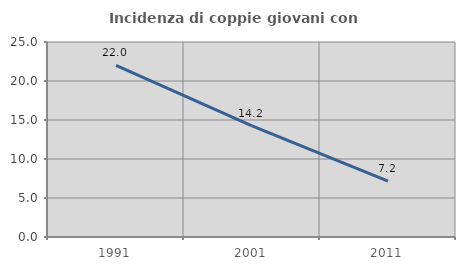
| Category | Incidenza di coppie giovani con figli |
|---|---|
| 1991.0 | 22.008 |
| 2001.0 | 14.248 |
| 2011.0 | 7.163 |